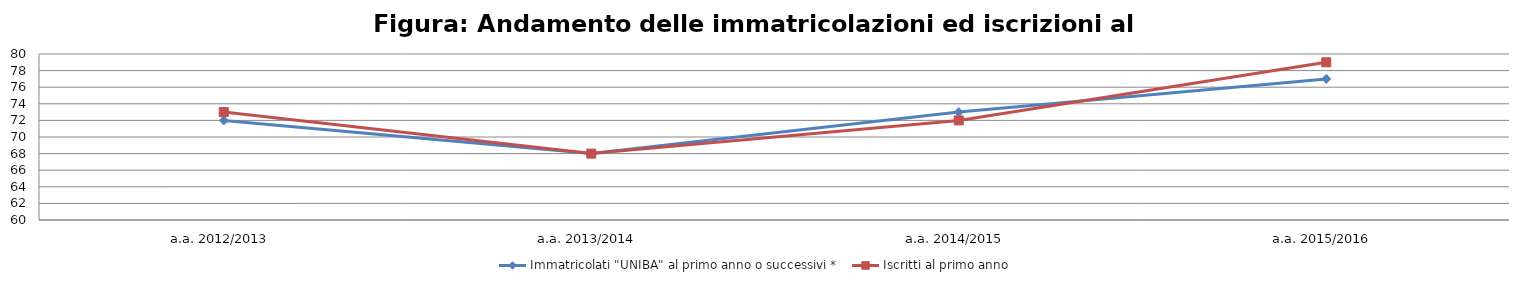
| Category | Immatricolati "UNIBA" al primo anno o successivi * | Iscritti al primo anno  |
|---|---|---|
| a.a. 2012/2013 | 72 | 73 |
| a.a. 2013/2014 | 68 | 68 |
| a.a. 2014/2015 | 73 | 72 |
| a.a. 2015/2016 | 77 | 79 |